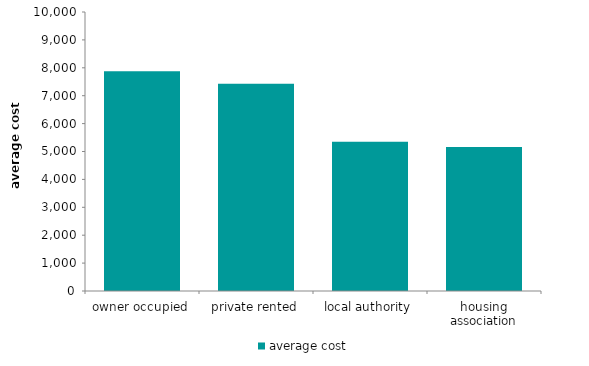
| Category | average cost |
|---|---|
| owner occupied | 7872.054 |
| private rented | 7430.062 |
| local authority | 5345.226 |
| housing association | 5157.671 |